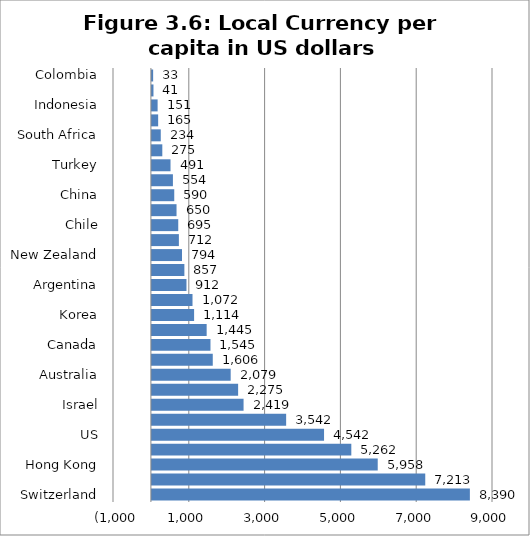
| Category | Local Currency per capita in US dollars |
|---|---|
| Switzerland | 8389.991 |
| Japan | 7212.563 |
| Hong Kong | 5958.432 |
| Singapore | 5261.655 |
| US | 4542.181 |
| Eurozone | 3542.156 |
| Israel | 2418.608 |
| Taiwan | 2275.067 |
| Australia | 2078.641 |
| Denmark | 1606.017 |
| Canada | 1545.483 |
| UK | 1444.958 |
| Korea | 1113.545 |
| Norway  | 1071.512 |
| Argentina | 912.229 |
| Russia | 857.04 |
| New Zealand | 793.616 |
| Sweden | 711.869 |
| Chile | 695.25 |
| Thailand | 650.002 |
| China | 589.801 |
| Mexico | 554.433 |
| Turkey | 491.241 |
| Brazil | 274.759 |
| South Africa | 234.01 |
| India | 165.026 |
| Indonesia | 150.862 |
| Nigeria | 41.328 |
| Colombia | 32.835 |